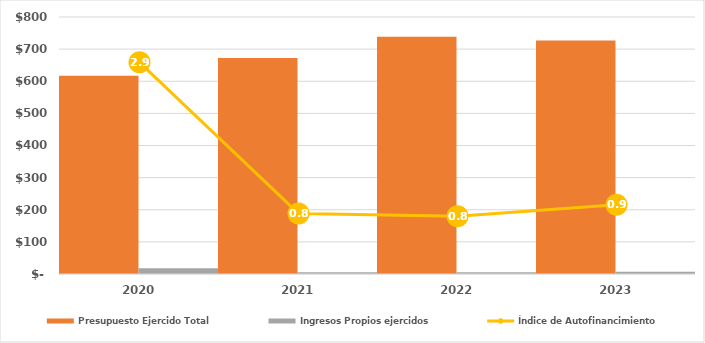
| Category | Presupuesto Ejercido Total | Ingresos Propios ejercidos |
|---|---|---|
| 2020.0 | 617347.742 | 17799.164 |
| 2021.0 | 672172.234 | 5535.108 |
| 2022.0 | 738205.545 | 5804.492 |
| 2023.0 | 727093.545 | 6853.161 |